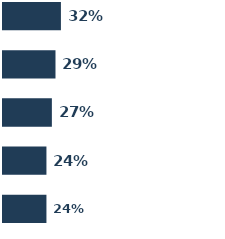
| Category | Series 0 | Series 1 | Series 2 | Series 3 | Series 4 |
|---|---|---|---|---|---|
| 0 | 0.32 | 0.29 | 0.27 | 0.24 | 0.24 |